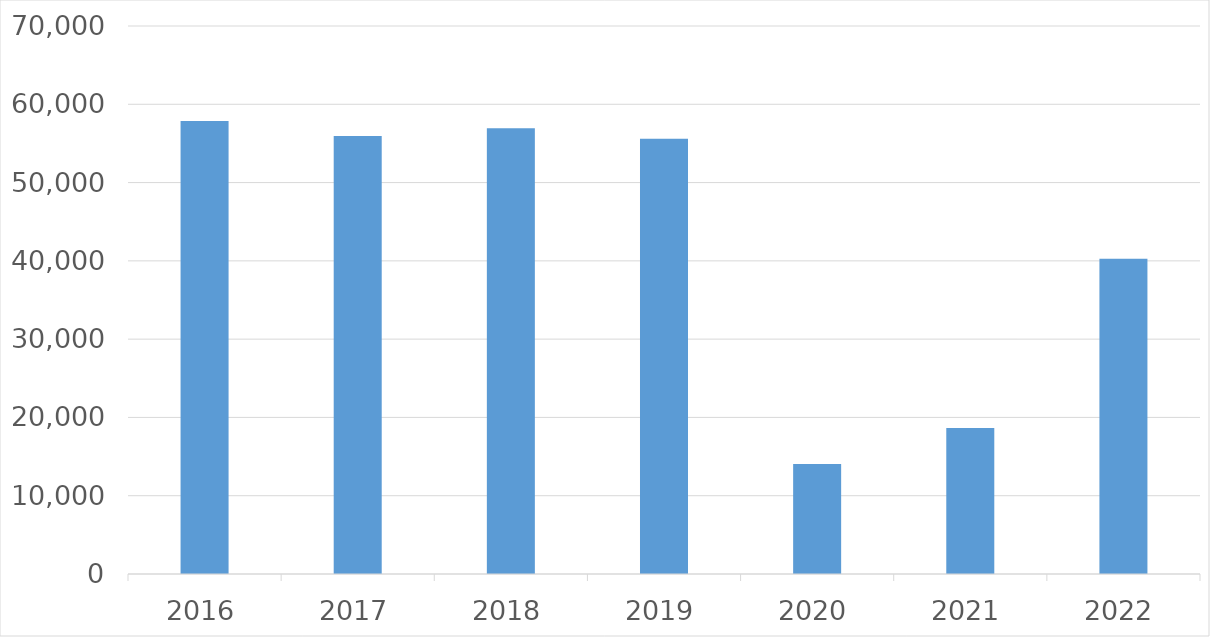
| Category | Series 0 |
|---|---|
| 2016 | 57858 |
| 2017 | 55964 |
| 2018 | 56943 |
| 2019 | 55597 |
| 2020 | 14045 |
| 2021 | 18659 |
| 2022 | 40263 |